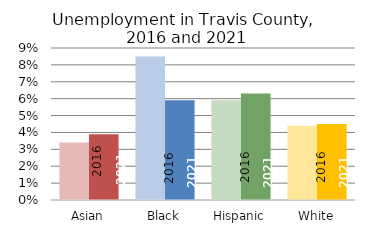
| Category | 2012-2016 | 2017-2021 |
|---|---|---|
| Asian | 0.034 | 0.039 |
| Black | 0.085 | 0.059 |
| Hispanic | 0.059 | 0.063 |
| White | 0.044 | 0.045 |